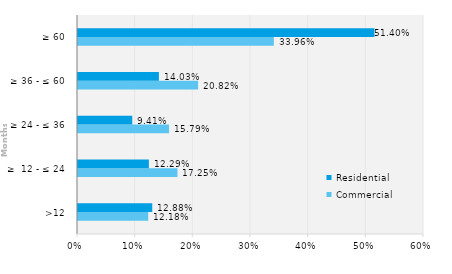
| Category | Commercial | Residential |
|---|---|---|
| >12 | 0.122 | 0.129 |
| ≥  12 - ≤ 24 | 0.172 | 0.123 |
| ≥ 24 - ≤ 36 | 0.158 | 0.094 |
| ≥ 36 - ≤ 60 | 0.208 | 0.14 |
| ≥ 60 | 0.34 | 0.514 |